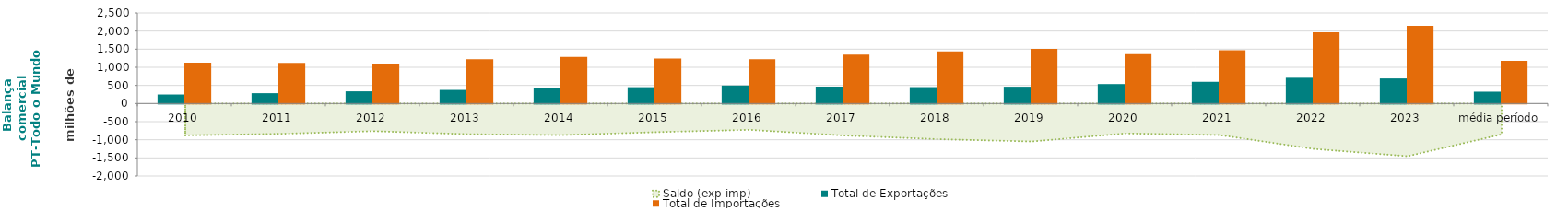
| Category | Total de Exportações  | Total de Importações  |
|---|---|---|
| 2010 | 249.295 | 1127.225 |
| 2011 | 285.356 | 1121.373 |
| 2012 | 336.709 | 1099.478 |
| 2013 | 376.062 | 1221.535 |
| 2014 | 414.884 | 1285.616 |
| 2015 | 450.666 | 1241.098 |
| 2016 | 496.378 | 1221.928 |
| 2017 | 466.755 | 1348.133 |
| 2018 | 452.591 | 1435.667 |
| 2019 | 463.518 | 1511.052 |
| 2020 | 537.257 | 1361.98 |
| 2021 | 599.63 | 1468.17 |
| 2022 | 711.404 | 1963.148 |
| 2023 | 692.412 | 2146.426 |
| média período | 327.099 | 1178.229 |